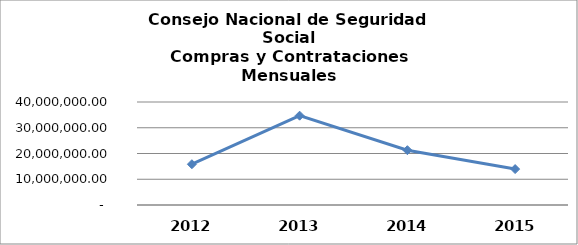
| Category | MONTO CONTRATADO |
|---|---|
| 2012 | 15835433.025 |
| 2013 | 34689055.037 |
| 2014 | 21289530.65 |
| 2015 | 13952558.43 |